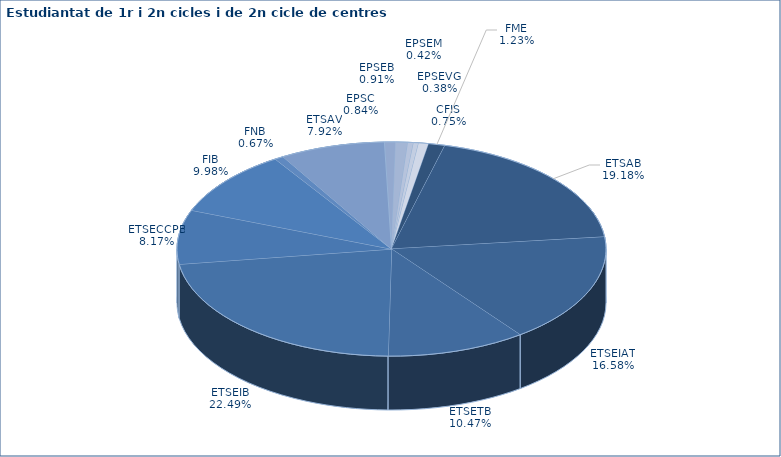
| Category | Series 0 |
|---|---|
| FME | 180 |
| ETSAB | 2799 |
| ETSEIAT | 2419 |
| ETSETB | 1528 |
| ETSEIB | 3281 |
| ETSECCPB | 1192 |
| FIB | 1456 |
| FNB | 98 |
| ETSAV | 1156 |
| EPSC | 122 |
| EPSEB | 133 |
| EPSEM | 62 |
| EPSEVG | 56 |
| CFIS | 109 |